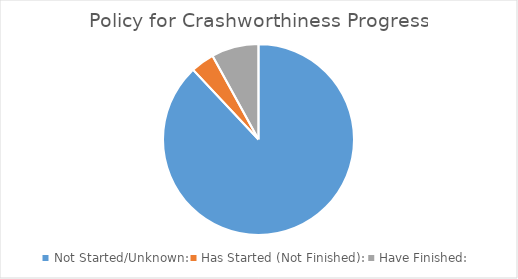
| Category | Series 0 |
|---|---|
| Not Started/Unknown: | 22 |
| Has Started (Not Finished): | 1 |
| Have Finished: | 2 |